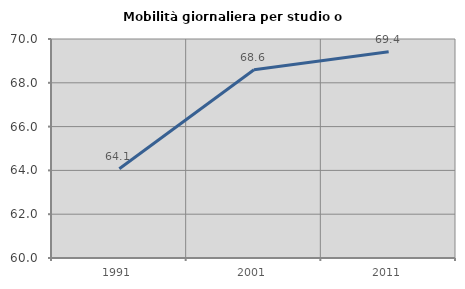
| Category | Mobilità giornaliera per studio o lavoro |
|---|---|
| 1991.0 | 64.073 |
| 2001.0 | 68.597 |
| 2011.0 | 69.42 |